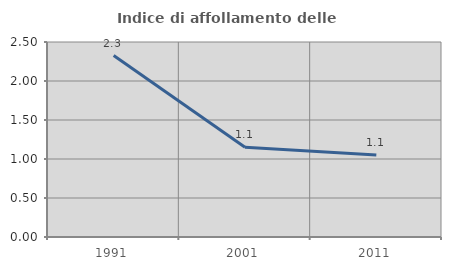
| Category | Indice di affollamento delle abitazioni  |
|---|---|
| 1991.0 | 2.326 |
| 2001.0 | 1.149 |
| 2011.0 | 1.053 |